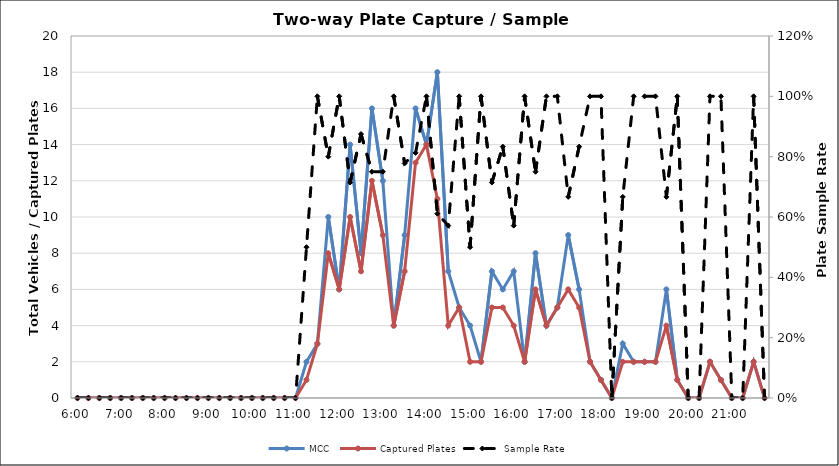
| Category | MCC | Captured Plates |
|---|---|---|
| 0.25 | 0 | 0 |
| 0.260416666666667 | 0 | 0 |
| 0.270833333333333 | 0 | 0 |
| 0.28125 | 0 | 0 |
| 0.291666666666667 | 0 | 0 |
| 0.302083333333333 | 0 | 0 |
| 0.3125 | 0 | 0 |
| 0.322916666666667 | 0 | 0 |
| 0.333333333333333 | 0 | 0 |
| 0.34375 | 0 | 0 |
| 0.354166666666667 | 0 | 0 |
| 0.364583333333333 | 0 | 0 |
| 0.375 | 0 | 0 |
| 0.385416666666667 | 0 | 0 |
| 0.395833333333333 | 0 | 0 |
| 0.40625 | 0 | 0 |
| 0.416666666666667 | 0 | 0 |
| 0.427083333333333 | 0 | 0 |
| 0.4375 | 0 | 0 |
| 0.447916666666667 | 0 | 0 |
| 0.458333333333333 | 0 | 0 |
| 0.46875 | 2 | 1 |
| 0.479166666666667 | 3 | 3 |
| 0.489583333333333 | 10 | 8 |
| 0.5 | 6 | 6 |
| 0.510416666666667 | 14 | 10 |
| 0.520833333333333 | 8 | 7 |
| 0.53125 | 16 | 12 |
| 0.541666666666667 | 12 | 9 |
| 0.552083333333333 | 4 | 4 |
| 0.5625 | 9 | 7 |
| 0.572916666666667 | 16 | 13 |
| 0.583333333333333 | 14 | 14 |
| 0.59375 | 18 | 11 |
| 0.604166666666667 | 7 | 4 |
| 0.614583333333333 | 5 | 5 |
| 0.625 | 4 | 2 |
| 0.635416666666667 | 2 | 2 |
| 0.645833333333333 | 7 | 5 |
| 0.65625 | 6 | 5 |
| 0.666666666666667 | 7 | 4 |
| 0.677083333333333 | 2 | 2 |
| 0.6875 | 8 | 6 |
| 0.697916666666667 | 4 | 4 |
| 0.708333333333333 | 5 | 5 |
| 0.71875 | 9 | 6 |
| 0.729166666666667 | 6 | 5 |
| 0.739583333333333 | 2 | 2 |
| 0.75 | 1 | 1 |
| 0.760416666666667 | 0 | 0 |
| 0.770833333333333 | 3 | 2 |
| 0.78125 | 2 | 2 |
| 0.791666666666667 | 2 | 2 |
| 0.802083333333333 | 2 | 2 |
| 0.8125 | 6 | 4 |
| 0.822916666666667 | 1 | 1 |
| 0.833333333333333 | 0 | 0 |
| 0.84375 | 0 | 0 |
| 0.854166666666667 | 2 | 2 |
| 0.864583333333333 | 1 | 1 |
| 0.875 | 0 | 0 |
| 0.885416666666667 | 0 | 0 |
| 0.895833333333333 | 2 | 2 |
| 0.90625 | 0 | 0 |